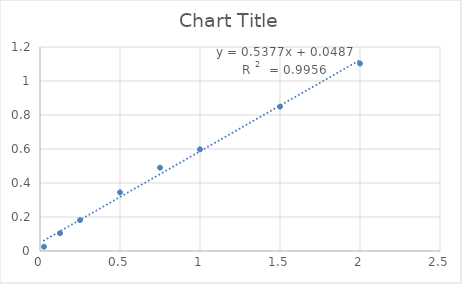
| Category | Series 0 |
|---|---|
| 2.0 | 1.103 |
| 1.5 | 0.849 |
| 1.0 | 0.598 |
| 0.75 | 0.49 |
| 0.5 | 0.345 |
| 0.25 | 0.182 |
| 0.125 | 0.104 |
| 0.025 | 0.025 |